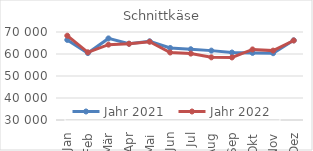
| Category | Jahr 2021 | Jahr 2022 |
|---|---|---|
| Jan | 66400.446 | 68319.199 |
| Feb | 60424.284 | 60773.641 |
| Mär | 67085.775 | 64252.356 |
| Apr | 64671.186 | 64646.323 |
| Mai | 65776.946 | 65572.543 |
| Jun | 62738.62 | 60683.222 |
| Jul | 62164.405 | 60183.67 |
| Aug | 61535.935 | 58483.015 |
| Sep | 60674.383 | 58433.921 |
| Okt | 60498.809 | 62075.361 |
| Nov | 60359.511 | 61535.526 |
| Dez | 66209.732 | 66140.932 |